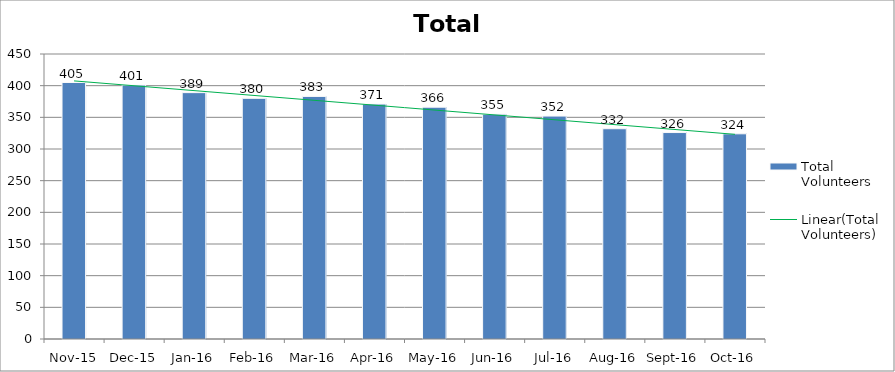
| Category | Total Volunteers |
|---|---|
| Nov-15 | 405 |
| Dec-15 | 401 |
| Jan-16 | 389 |
| Feb-16 | 380 |
| Mar-16 | 383 |
| Apr-16 | 371 |
| May-16 | 366 |
| Jun-16 | 355 |
| Jul-16 | 352 |
| Aug-16 | 332 |
| Sep-16 | 326 |
| Oct-16 | 324 |